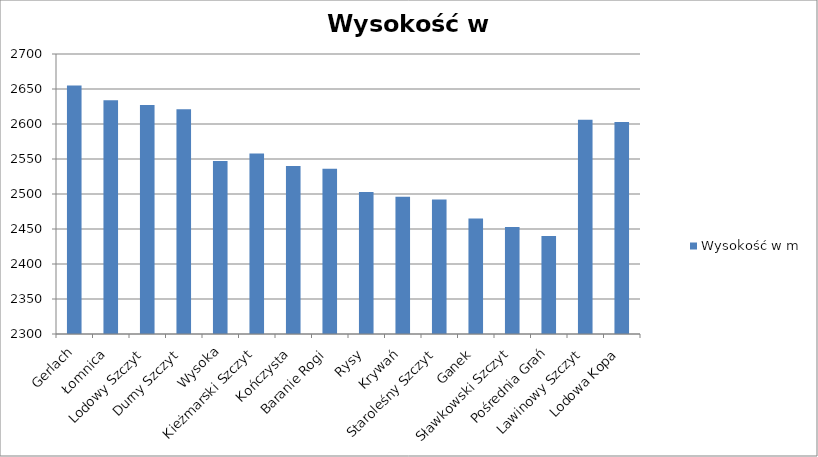
| Category | Wysokość w m |
|---|---|
| Gerlach | 2655 |
| Łomnica | 2634 |
| Lodowy Szczyt | 2627 |
| Durny Szczyt | 2621 |
| Wysoka | 2547 |
| Kieżmarski Szczyt | 2558 |
| Kończysta | 2540 |
| Baranie Rogi | 2536 |
| Rysy | 2503 |
| Krywań | 2496 |
| Staroleśny Szczyt | 2492 |
| Ganek | 2465 |
| Sławkowski Szczyt | 2453 |
| Pośrednia Grań | 2440 |
| Lawinowy Szczyt | 2606 |
| Lodowa Kopa | 2603 |